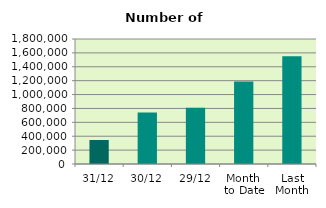
| Category | Series 0 |
|---|---|
| 31/12 | 345604 |
| 30/12 | 742616 |
| 29/12 | 808544 |
| Month 
to Date | 1187425.652 |
| Last
Month | 1553278.182 |